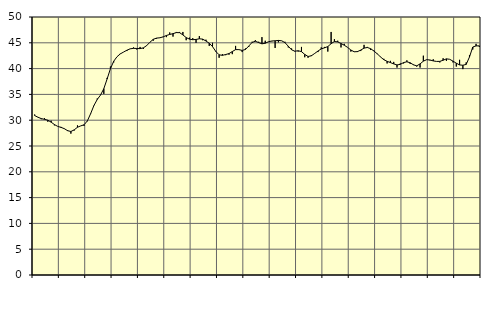
| Category | Piggar | Series 1 |
|---|---|---|
| nan | 31.1 | 30.9 |
| 87.0 | 30.6 | 30.58 |
| 87.0 | 30.2 | 30.31 |
| 87.0 | 30.4 | 30.17 |
| nan | 29.7 | 30 |
| 88.0 | 29.9 | 29.62 |
| 88.0 | 29 | 29.16 |
| 88.0 | 28.8 | 28.8 |
| nan | 28.7 | 28.61 |
| 89.0 | 28.4 | 28.36 |
| 89.0 | 28.1 | 27.97 |
| 89.0 | 27.4 | 27.81 |
| nan | 28 | 28.13 |
| 90.0 | 29 | 28.63 |
| 90.0 | 28.9 | 28.9 |
| 90.0 | 28.9 | 29.11 |
| nan | 29.8 | 29.86 |
| 91.0 | 31.2 | 31.27 |
| 91.0 | 32.8 | 32.85 |
| 91.0 | 34.2 | 34.02 |
| nan | 34.9 | 34.87 |
| 92.0 | 35.1 | 36.11 |
| 92.0 | 38.2 | 37.99 |
| 92.0 | 40.4 | 39.97 |
| nan | 41.2 | 41.43 |
| 93.0 | 42.3 | 42.3 |
| 93.0 | 42.9 | 42.85 |
| 93.0 | 43.2 | 43.21 |
| nan | 43.4 | 43.56 |
| 94.0 | 43.8 | 43.83 |
| 94.0 | 44.1 | 43.93 |
| 94.0 | 43.7 | 43.9 |
| nan | 44.2 | 43.87 |
| 95.0 | 43.8 | 44.02 |
| 95.0 | 44.5 | 44.45 |
| 95.0 | 45.1 | 45.11 |
| nan | 45.4 | 45.67 |
| 96.0 | 45.8 | 45.91 |
| 96.0 | 46 | 45.97 |
| 96.0 | 46.1 | 46.15 |
| nan | 46.1 | 46.42 |
| 97.0 | 47 | 46.62 |
| 97.0 | 46.2 | 46.77 |
| 97.0 | 47.1 | 46.98 |
| nan | 47.1 | 46.96 |
| 98.0 | 47.1 | 46.53 |
| 98.0 | 45.5 | 46.01 |
| 98.0 | 46 | 45.71 |
| nan | 45.9 | 45.6 |
| 99.0 | 45 | 45.65 |
| 99.0 | 46.3 | 45.78 |
| 99.0 | 45.5 | 45.71 |
| nan | 45.6 | 45.35 |
| 0.0 | 44.4 | 44.91 |
| 0.0 | 45 | 44.26 |
| 0.0 | 43.4 | 43.32 |
| nan | 42.1 | 42.67 |
| 1.0 | 42.8 | 42.57 |
| 1.0 | 42.6 | 42.73 |
| 1.0 | 42.7 | 42.91 |
| nan | 42.8 | 43.3 |
| 2.0 | 44.4 | 43.68 |
| 2.0 | 43.7 | 43.68 |
| 2.0 | 43.2 | 43.52 |
| nan | 43.9 | 43.71 |
| 3.0 | 44.2 | 44.37 |
| 3.0 | 45.2 | 45.07 |
| 3.0 | 45.5 | 45.3 |
| nan | 45.2 | 45.04 |
| 4.0 | 46.1 | 44.8 |
| 4.0 | 45.4 | 44.91 |
| 4.0 | 45.2 | 45.21 |
| nan | 45.3 | 45.35 |
| 5.0 | 44 | 45.39 |
| 5.0 | 45.1 | 45.46 |
| 5.0 | 45.4 | 45.39 |
| nan | 45.2 | 45.02 |
| 6.0 | 44.1 | 44.34 |
| 6.0 | 43.9 | 43.64 |
| 6.0 | 43.3 | 43.37 |
| nan | 43.3 | 43.46 |
| 7.0 | 44.2 | 43.29 |
| 7.0 | 42.2 | 42.75 |
| 7.0 | 42.1 | 42.35 |
| nan | 42.6 | 42.48 |
| 8.0 | 42.9 | 42.93 |
| 8.0 | 43.2 | 43.4 |
| 8.0 | 44.1 | 43.82 |
| nan | 44.2 | 44.03 |
| 9.0 | 43.3 | 44.27 |
| 9.0 | 47.1 | 44.83 |
| 9.0 | 45.7 | 45.25 |
| nan | 45.4 | 45.18 |
| 10.0 | 44.1 | 44.86 |
| 10.0 | 44.8 | 44.53 |
| 10.0 | 44.1 | 44.11 |
| nan | 43.3 | 43.6 |
| 11.0 | 43.3 | 43.26 |
| 11.0 | 43.4 | 43.29 |
| 11.0 | 43.4 | 43.59 |
| nan | 44.6 | 43.97 |
| 12.0 | 44.2 | 44.09 |
| 12.0 | 43.6 | 43.86 |
| 12.0 | 43.5 | 43.4 |
| nan | 42.8 | 42.87 |
| 13.0 | 42.3 | 42.26 |
| 13.0 | 41.9 | 41.72 |
| 13.0 | 41 | 41.41 |
| nan | 41.5 | 41.17 |
| 14.0 | 41.3 | 40.91 |
| 14.0 | 40.2 | 40.71 |
| 14.0 | 41 | 40.82 |
| nan | 41 | 41.17 |
| 15.0 | 41.6 | 41.32 |
| 15.0 | 40.9 | 41.13 |
| 15.0 | 40.8 | 40.73 |
| nan | 40.4 | 40.54 |
| 16.0 | 40.2 | 40.91 |
| 16.0 | 42.5 | 41.44 |
| 16.0 | 41.7 | 41.73 |
| nan | 41.6 | 41.67 |
| 17.0 | 41.8 | 41.49 |
| 17.0 | 41.4 | 41.39 |
| 17.0 | 41.2 | 41.4 |
| nan | 42 | 41.62 |
| 18.0 | 41.5 | 41.89 |
| 18.0 | 41.8 | 41.8 |
| 18.0 | 41.2 | 41.44 |
| nan | 40.4 | 41.05 |
| 19.0 | 41.7 | 40.71 |
| 19.0 | 39.9 | 40.65 |
| 19.0 | 41.2 | 40.81 |
| nan | 42.6 | 42.25 |
| 20.0 | 43.7 | 44.18 |
| 20.0 | 44.8 | 44.4 |
| 20.0 | 44.2 | 44.41 |